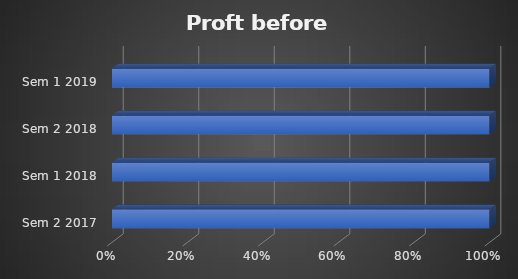
| Category | Proft before tax |
|---|---|
|  Sem 2 2017 | 16800 |
| Sem 1 2018 | 107960 |
| Sem 2 2018 | 132320 |
| Sem 1 2019 | 145700 |